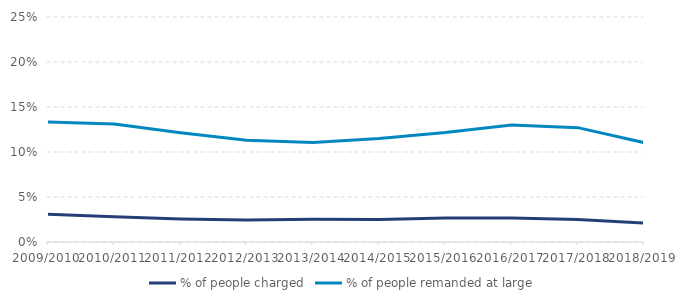
| Category | % of people charged | % of people remanded at large |
|---|---|---|
| 2009/2010 | 0.031 | 0.133 |
| 2010/2011 | 0.028 | 0.131 |
| 2011/2012 | 0.026 | 0.121 |
| 2012/2013 | 0.024 | 0.113 |
| 2013/2014 | 0.025 | 0.11 |
| 2014/2015 | 0.025 | 0.115 |
| 2015/2016 | 0.027 | 0.122 |
| 2016/2017 | 0.027 | 0.13 |
| 2017/2018 | 0.025 | 0.127 |
| 2018/2019 | 0.021 | 0.11 |